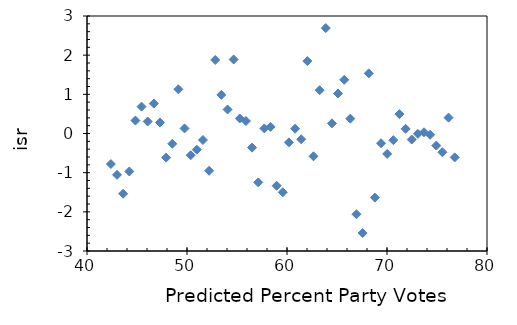
| Category | Series 0 |
|---|---|
| 76.77132486388382 | -0.61 |
| 76.15731138190301 | 0.405 |
| 75.54329789992221 | -0.478 |
| 74.9292844179414 | -0.308 |
| 74.3152709359606 | -0.033 |
| 73.70125745397979 | 0.031 |
| 73.08724397199899 | -0.009 |
| 72.47323049001807 | -0.154 |
| 71.85921700803726 | 0.119 |
| 71.24520352605646 | 0.495 |
| 70.63119004407565 | -0.17 |
| 70.01717656209485 | -0.521 |
| 69.40316308011404 | -0.249 |
| 68.78914959813324 | -1.636 |
| 68.17513611615243 | 1.535 |
| 67.56112263417162 | -2.541 |
| 66.94710915219082 | -2.062 |
| 66.33309567021001 | 0.379 |
| 65.71908218822921 | 1.371 |
| 65.10506870624829 | 1.021 |
| 64.49105522426748 | 0.259 |
| 63.87704174228668 | 2.691 |
| 63.26302826030587 | 1.106 |
| 62.64901477832507 | -0.582 |
| 62.03500129634426 | 1.849 |
| 61.42098781436346 | -0.146 |
| 60.80697433238265 | 0.123 |
| 60.192960850401846 | -0.226 |
| 59.57894736842104 | -1.5 |
| 58.964933886440235 | -1.334 |
| 58.35092040445943 | 0.17 |
| 57.736906922478624 | 0.13 |
| 57.122893440497705 | -1.248 |
| 56.5088799585169 | -0.361 |
| 55.894866476536095 | 0.32 |
| 55.28085299455529 | 0.383 |
| 54.666839512574484 | 1.89 |
| 54.05282603059368 | 0.613 |
| 53.43881254861287 | 0.987 |
| 52.82479906663207 | 1.877 |
| 52.21078558465126 | -0.952 |
| 51.59677210267046 | -0.165 |
| 50.98275862068965 | -0.412 |
| 50.368745138708846 | -0.556 |
| 49.75473165672793 | 0.129 |
| 49.14071817474712 | 1.128 |
| 48.526704692766316 | -0.263 |
| 47.91269121078551 | -0.616 |
| 47.298677728804705 | 0.282 |
| 46.6846642468239 | 0.764 |
| 46.070650764843094 | 0.306 |
| 45.45663728286229 | 0.685 |
| 44.84262380088148 | 0.331 |
| 44.22861031890068 | -0.969 |
| 43.61459683691987 | -1.538 |
| 43.00058335493907 | -1.054 |
| 42.38656987295826 | -0.78 |